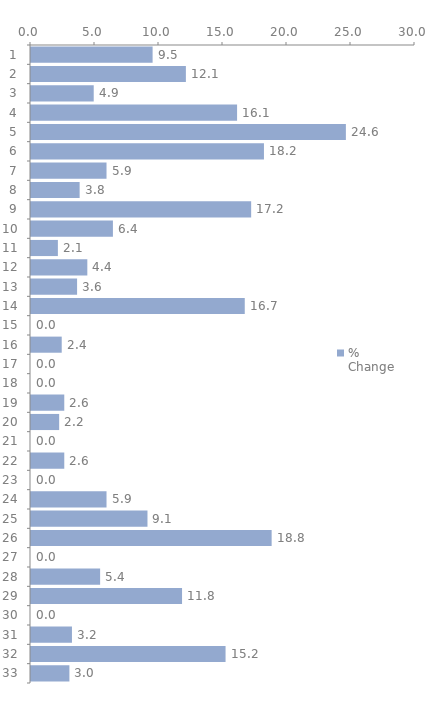
| Category | % Change |
|---|---|
| 1.0 | 9.5 |
| 2.0 | 12.1 |
| 3.0 | 4.9 |
| 4.0 | 16.1 |
| 5.0 | 24.6 |
| 6.0 | 18.2 |
| 7.0 | 5.9 |
| 8.0 | 3.8 |
| 9.0 | 17.2 |
| 10.0 | 6.4 |
| 11.0 | 2.1 |
| 12.0 | 4.4 |
| 13.0 | 3.6 |
| 14.0 | 16.7 |
| 15.0 | 0 |
| 16.0 | 2.4 |
| 17.0 | 0 |
| 18.0 | 0 |
| 19.0 | 2.6 |
| 20.0 | 2.2 |
| 21.0 | 0 |
| 22.0 | 2.6 |
| 23.0 | 0 |
| 24.0 | 5.9 |
| 25.0 | 9.1 |
| 26.0 | 18.8 |
| 27.0 | 0 |
| 28.0 | 5.4 |
| 29.0 | 11.8 |
| 30.0 | 0 |
| 31.0 | 3.2 |
| 32.0 | 15.2 |
| 33.0 | 3 |